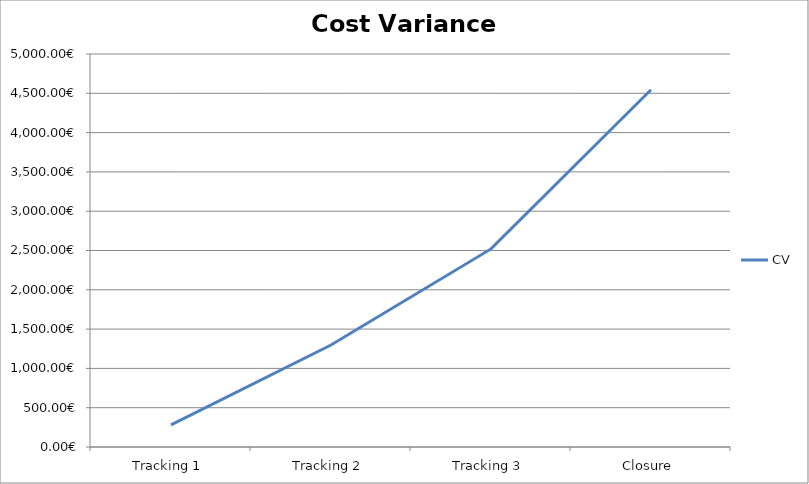
| Category | CV |
|---|---|
| Tracking 1 | 280.5 |
| Tracking 2 | 1297.5 |
| Tracking 3 | 2520 |
| Closure | 4545 |